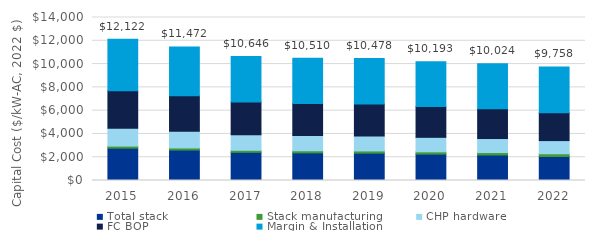
| Category | Total stack | Stack manufacturing | CHP hardware | FC BOP | Margin & Installation |
|---|---|---|---|---|---|
| 2015.0 | 2774.746 | 178.684 | 1526.066 | 3231.587 | 4410.764 |
| 2016.0 | 2616.683 | 177.714 | 1439.134 | 3047.499 | 4190.905 |
| 2017.0 | 2419.718 | 173.419 | 1330.807 | 2818.106 | 3903.65 |
| 2018.0 | 2373.466 | 180.475 | 1305.369 | 2764.238 | 3886.541 |
| 2019.0 | 2348.059 | 190.018 | 1291.395 | 2734.649 | 3914.101 |
| 2020.0 | 2266.48 | 194.847 | 1246.528 | 2639.638 | 3845.469 |
| 2021.0 | 2190.883 | 208.646 | 1204.951 | 2551.595 | 3867.857 |
| 2022.0 | 2058.66 | 237.087 | 1132.23 | 2397.602 | 3932.584 |